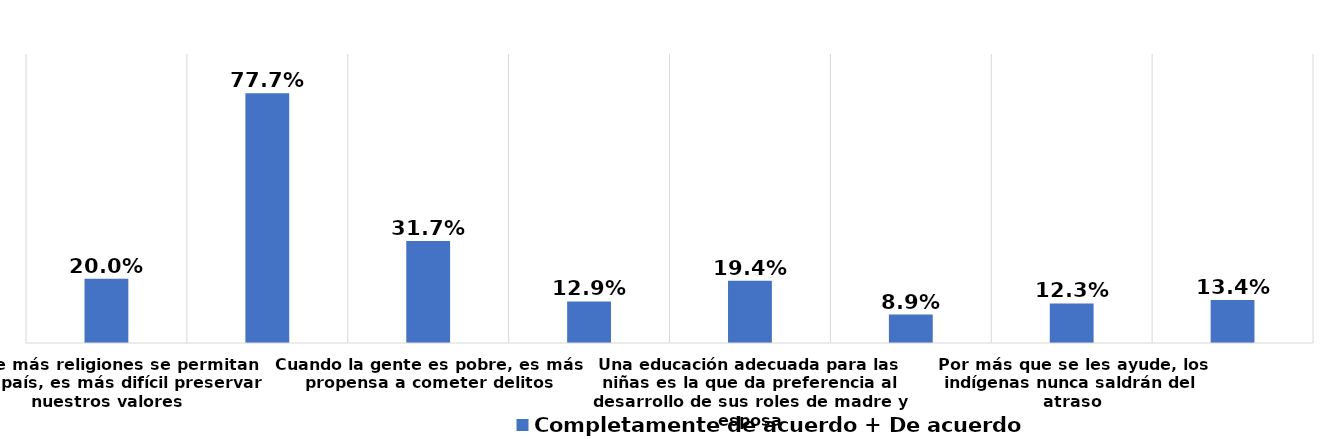
| Category | Completamente de acuerdo + De acuerdo |
|---|---|
| Entre más religiones se permitan en el país, es más difícil preservar nuestros valores | 0.2 |
| A los homosexuales se les debe permitir ser profesores de colegio | 0.777 |
| Cuando la gente es pobre, es más propensa a cometer delitos | 0.317 |
| Por sus características, los negros siempre tendrán limitaciones | 0.129 |
| Una educación adecuada para las niñas es la que da preferencia al desarrollo de sus roles de madre y esposa | 0.194 |
| Las personas enfermas de SIDA deben ser alejadas del resto de las personas | 0.089 |
| Por más que se les ayude, los indígenas nunca saldrán del atraso | 0.123 |
| Las personas discapacitadas pueden ser buenas trabajadoras, pero no en niveles directivos | 0.134 |